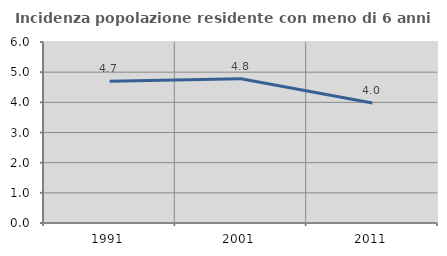
| Category | Incidenza popolazione residente con meno di 6 anni |
|---|---|
| 1991.0 | 4.696 |
| 2001.0 | 4.781 |
| 2011.0 | 3.977 |